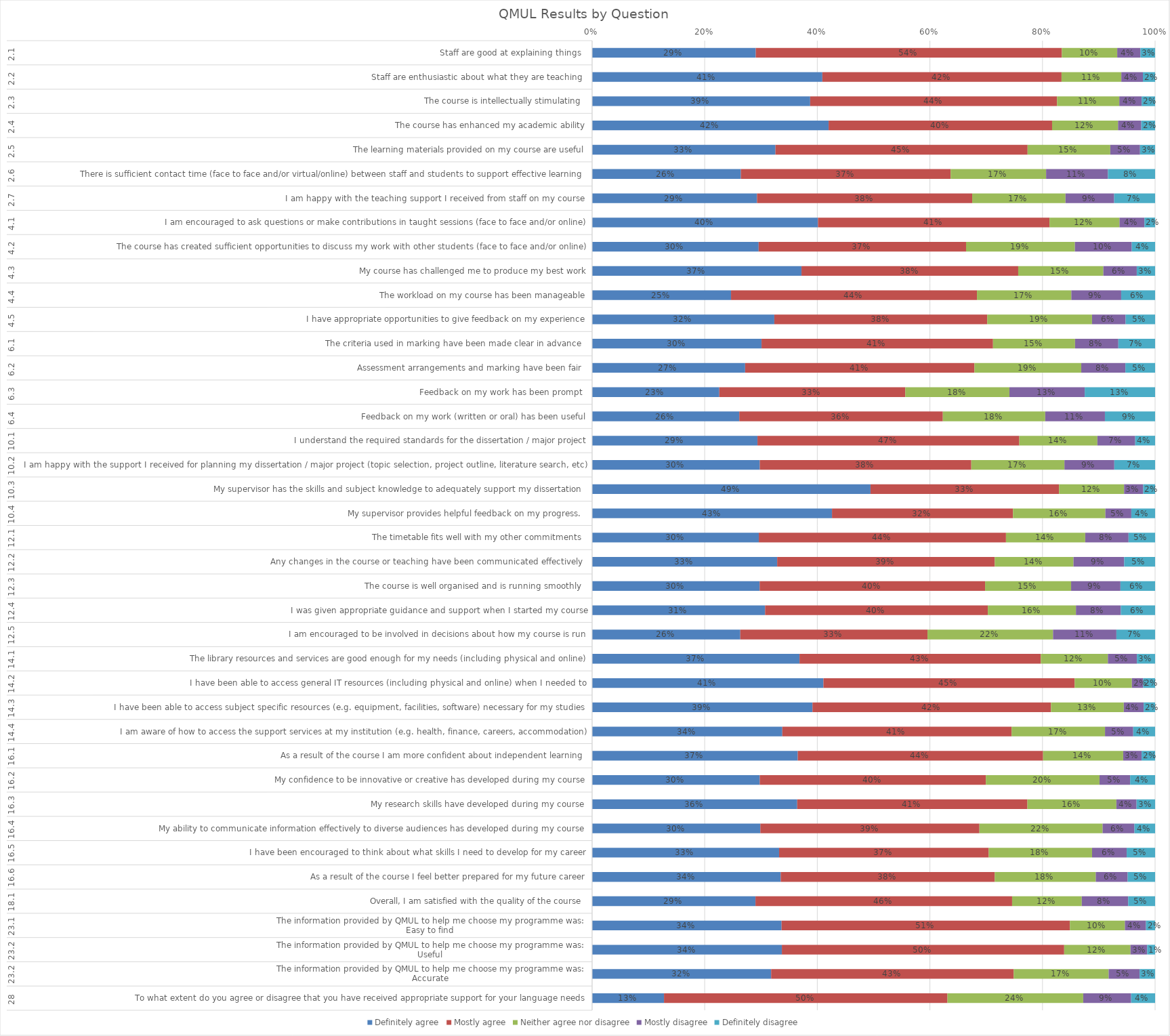
| Category | Definitely agree | Mostly agree | Neither agree nor disagree | Mostly disagree | Definitely disagree |
|---|---|---|---|---|---|
| 0 | 0.291 | 0.544 | 0.098 | 0.041 | 0.026 |
| 1 | 0.409 | 0.425 | 0.106 | 0.038 | 0.022 |
| 2 | 0.387 | 0.439 | 0.111 | 0.04 | 0.024 |
| 3 | 0.42 | 0.397 | 0.117 | 0.041 | 0.025 |
| 4 | 0.326 | 0.448 | 0.147 | 0.053 | 0.027 |
| 5 | 0.264 | 0.373 | 0.17 | 0.11 | 0.084 |
| 6 | 0.293 | 0.382 | 0.166 | 0.086 | 0.073 |
| 7 | 0.401 | 0.411 | 0.124 | 0.044 | 0.019 |
| 8 | 0.296 | 0.368 | 0.193 | 0.101 | 0.041 |
| 9 | 0.372 | 0.385 | 0.151 | 0.059 | 0.033 |
| 10 | 0.247 | 0.437 | 0.168 | 0.089 | 0.06 |
| 11 | 0.324 | 0.378 | 0.186 | 0.06 | 0.052 |
| 12 | 0.301 | 0.411 | 0.146 | 0.077 | 0.065 |
| 13 | 0.272 | 0.407 | 0.19 | 0.078 | 0.053 |
| 14 | 0.226 | 0.33 | 0.185 | 0.134 | 0.125 |
| 15 | 0.261 | 0.362 | 0.182 | 0.106 | 0.089 |
| 16 | 0.294 | 0.465 | 0.139 | 0.067 | 0.035 |
| 17 | 0.298 | 0.376 | 0.165 | 0.089 | 0.072 |
| 18 | 0.494 | 0.335 | 0.116 | 0.034 | 0.021 |
| 19 | 0.426 | 0.321 | 0.164 | 0.046 | 0.042 |
| 20 | 0.296 | 0.439 | 0.141 | 0.077 | 0.047 |
| 21 | 0.329 | 0.387 | 0.14 | 0.09 | 0.055 |
| 22 | 0.298 | 0.4 | 0.153 | 0.088 | 0.062 |
| 23 | 0.307 | 0.396 | 0.157 | 0.08 | 0.061 |
| 24 | 0.263 | 0.333 | 0.223 | 0.113 | 0.069 |
| 25 | 0.368 | 0.429 | 0.119 | 0.051 | 0.032 |
| 26 | 0.411 | 0.446 | 0.102 | 0.02 | 0.021 |
| 27 | 0.391 | 0.424 | 0.129 | 0.035 | 0.02 |
| 28 | 0.338 | 0.407 | 0.166 | 0.05 | 0.039 |
| 29 | 0.365 | 0.436 | 0.142 | 0.033 | 0.024 |
| 30 | 0.298 | 0.402 | 0.202 | 0.054 | 0.044 |
| 31 | 0.364 | 0.409 | 0.158 | 0.036 | 0.033 |
| 32 | 0.299 | 0.389 | 0.219 | 0.057 | 0.037 |
| 33 | 0.332 | 0.372 | 0.184 | 0.061 | 0.05 |
| 34 | 0.335 | 0.38 | 0.18 | 0.057 | 0.049 |
| 35 | 0.29 | 0.456 | 0.124 | 0.082 | 0.048 |
| 36 | 0.337 | 0.512 | 0.098 | 0.037 | 0.016 |
| 37 | 0.337 | 0.501 | 0.118 | 0.03 | 0.014 |
| 38 | 0.318 | 0.431 | 0.169 | 0.055 | 0.027 |
| 39 | 0.128 | 0.504 | 0.241 | 0.085 | 0.043 |